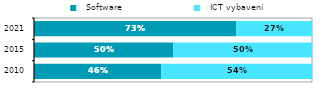
| Category |   Software |   ICT vybavení |
|---|---|---|
| 2010.0 | 0.458 | 0.542 |
| 2015.0 | 0.501 | 0.499 |
| 2021.0 | 0.728 | 0.272 |